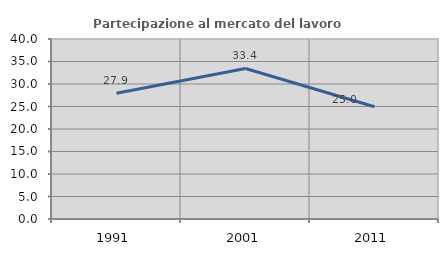
| Category | Partecipazione al mercato del lavoro  femminile |
|---|---|
| 1991.0 | 27.948 |
| 2001.0 | 33.449 |
| 2011.0 | 24.956 |